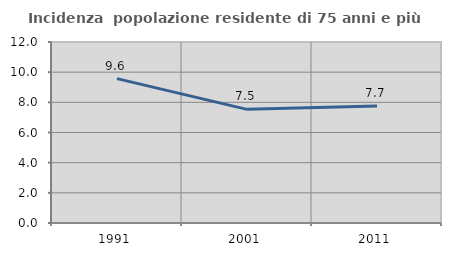
| Category | Incidenza  popolazione residente di 75 anni e più |
|---|---|
| 1991.0 | 9.571 |
| 2001.0 | 7.535 |
| 2011.0 | 7.75 |